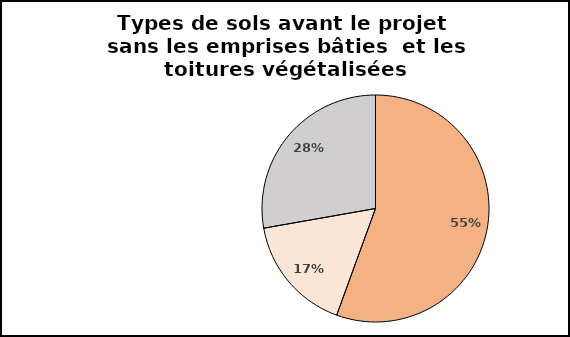
| Category | Series 0 |
|---|---|
| Sols en pleine terre | 50 |
| Sols apparents | 15 |
| Sols revêtus | 25 |